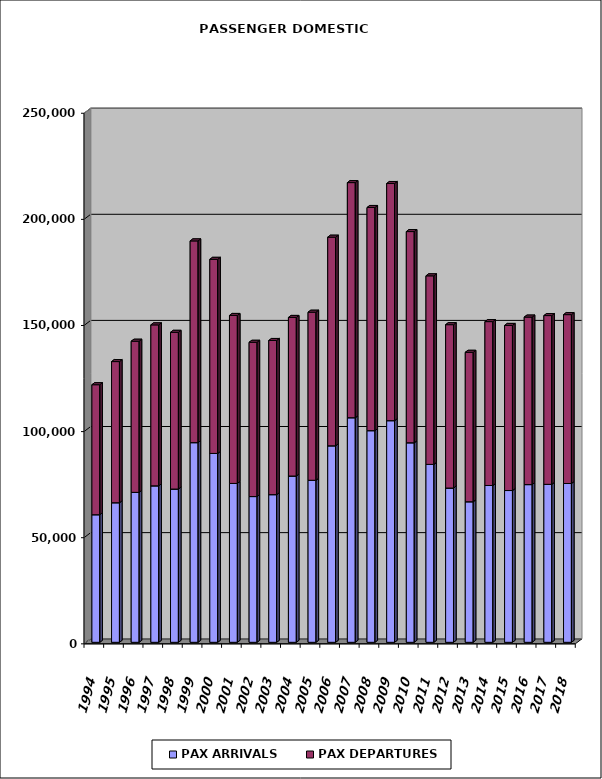
| Category | PAX ARRIVALS | PAX DEPARTURES |
|---|---|---|
| 1994.0 | 60122 | 61248 |
| 1995.0 | 65769 | 66500 |
| 1996.0 | 70656 | 71208 |
| 1997.0 | 73734 | 75830 |
| 1998.0 | 72216 | 73840 |
| 1999.0 | 94085 | 95047 |
| 2000.0 | 88999 | 91447 |
| 2001.0 | 74864 | 79140 |
| 2002.0 | 68674 | 72688 |
| 2003.0 | 69584 | 72628 |
| 2004.0 | 78360 | 74707 |
| 2005.0 | 76355 | 79179 |
| 2006.0 | 92586 | 98293 |
| 2007.0 | 105823 | 110782 |
| 2008.0 | 99732 | 105141 |
| 2009.0 | 104440 | 111734 |
| 2010.0 | 94025 | 99505 |
| 2011.0 | 83834 | 88838 |
| 2012.0 | 72686 | 76978 |
| 2013.0 | 66230 | 70411 |
| 2014.0 | 73886 | 77221 |
| 2015.0 | 71520 | 77782 |
| 2016.0 | 74314 | 78926 |
| 2017.0 | 74434 | 79519 |
| 2018.0 | 74825 | 79572 |